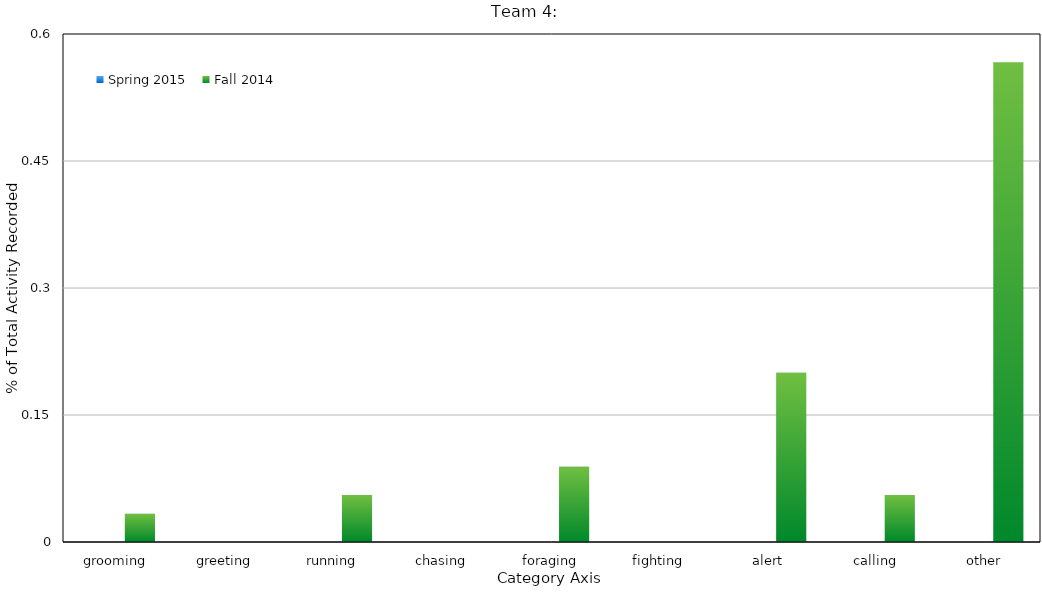
| Category | Spring 2015 | Fall 2014 |
|---|---|---|
| grooming |  | 0.033 |
| greeting |  | 0 |
| running |  | 0.056 |
| chasing |  | 0 |
| foraging |  | 0.089 |
| fighting |  | 0 |
| alert |  | 0.2 |
| calling |  | 0.056 |
| other |  | 0.567 |